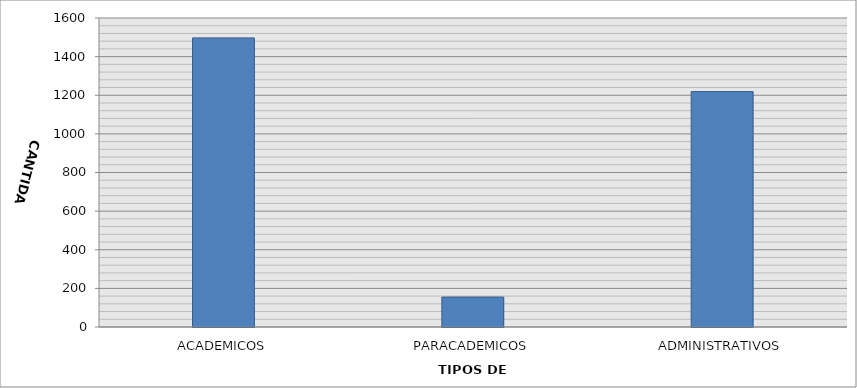
| Category | CANTIDAD |
|---|---|
| ACADEMICOS | 1497 |
| PARACADEMICOS | 155 |
| ADMINISTRATIVOS | 1219 |